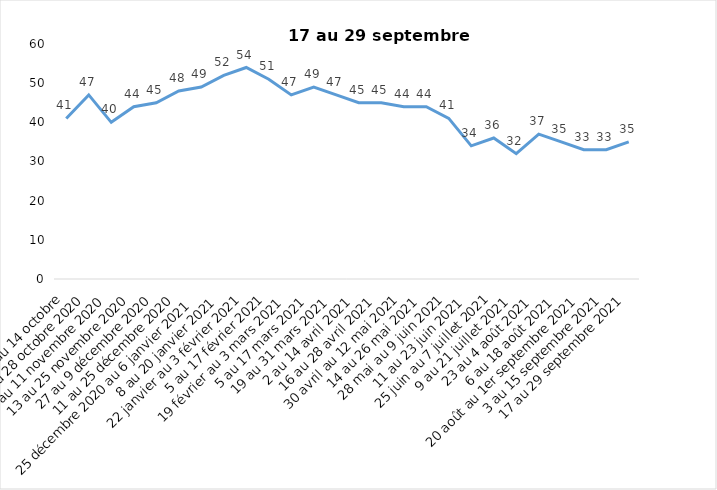
| Category | Toujours aux trois mesures |
|---|---|
| 2 au 14 octobre | 41 |
| 16 au 28 octobre 2020 | 47 |
| 30 octobre au 11 novembre 2020 | 40 |
| 13 au 25 novembre 2020 | 44 |
| 27 au 9 décembre 2020 | 45 |
| 11 au 25 décembre 2020 | 48 |
| 25 décembre 2020 au 6 janvier 2021 | 49 |
| 8 au 20 janvier 2021 | 52 |
| 22 janvier au 3 février 2021 | 54 |
| 5 au 17 février 2021 | 51 |
| 19 février au 3 mars 2021 | 47 |
| 5 au 17 mars 2021 | 49 |
| 19 au 31 mars 2021 | 47 |
| 2 au 14 avril 2021 | 45 |
| 16 au 28 avril 2021 | 45 |
| 30 avril au 12 mai 2021 | 44 |
| 14 au 26 mai 2021 | 44 |
| 28 mai au 9 juin 2021 | 41 |
| 11 au 23 juin 2021 | 34 |
| 25 juin au 7 juillet 2021 | 36 |
| 9 au 21 juillet 2021 | 32 |
| 23 au 4 août 2021 | 37 |
| 6 au 18 août 2021 | 35 |
| 20 août au 1er septembre 2021 | 33 |
| 3 au 15 septembre 2021 | 33 |
| 17 au 29 septembre 2021 | 35 |